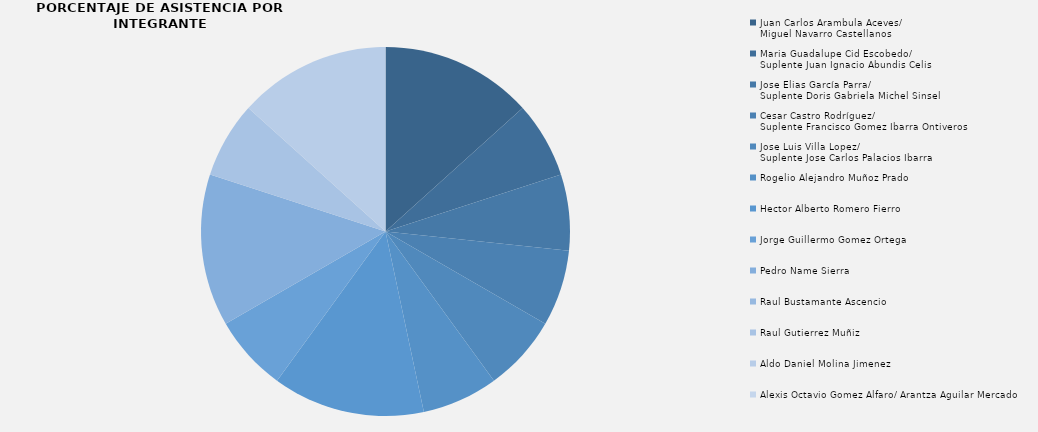
| Category | Series 0 |
|---|---|
| Juan Carlos Arambula Aceves/
Miguel Navarro Castellanos
 | 2 |
| Maria Guadalupe Cid Escobedo/
Suplente Juan Ignacio Abundis Celis  | 1 |
| Jose Elias García Parra/
Suplente Doris Gabriela Michel Sinsel | 1 |
| Cesar Castro Rodríguez/
Suplente Francisco Gomez Ibarra Ontiveros | 1 |
| Jose Luis Villa Lopez/
Suplente Jose Carlos Palacios Ibarra | 1 |
| Rogelio Alejandro Muñoz Prado  | 1 |
| Hector Alberto Romero Fierro | 2 |
| Jorge Guillermo Gomez Ortega  | 1 |
| Pedro Name Sierra  | 2 |
| Raul Bustamante Ascencio  | 0 |
| Raul Gutierrez Muñiz  | 1 |
| Aldo Daniel Molina Jimenez  | 2 |
| Alexis Octavio Gomez Alfaro/ Arantza Aguilar Mercado | 0 |